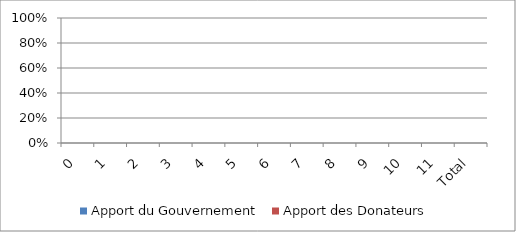
| Category | Apport du Gouvernement | Apport des Donateurs |
|---|---|---|
| 0 | 0 | 0 |
| 1 | 0 | 0 |
| 2 | 0 | 0 |
| 3 | 0 | 0 |
| 4 | 0 | 0 |
| 5 | 0 | 0 |
| 6 | 0 | 0 |
| 7 | 0 | 0 |
| 8 | 0 | 0 |
| 9 | 0 | 0 |
| 10 | 0 | 0 |
| 11 | 0 | 0 |
| Total | 0 | 0 |